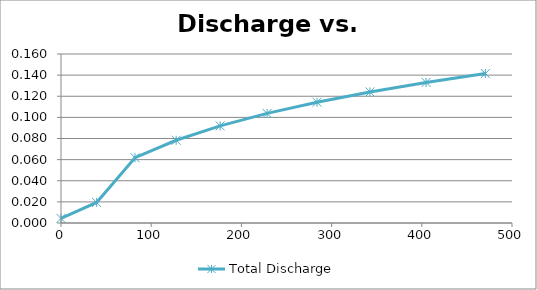
| Category | Total Discharge |
|---|---|
| 0.0 | 0.004 |
| 39.504000000000005 | 0.019 |
| 82.03200000000001 | 0.062 |
| 127.656 | 0.078 |
| 176.448 | 0.092 |
| 228.48000000000002 | 0.104 |
| 283.824 | 0.114 |
| 342.552 | 0.124 |
| 404.73600000000005 | 0.133 |
| 470.44800000000004 | 0.142 |